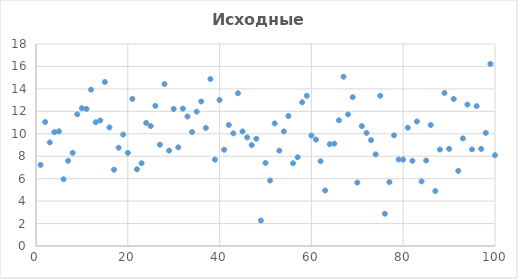
| Category | Series 0 |
|---|---|
| 0 | 7.227 |
| 1 | 11.049 |
| 2 | 9.231 |
| 3 | 10.143 |
| 4 | 10.217 |
| 5 | 5.946 |
| 6 | 7.589 |
| 7 | 8.308 |
| 8 | 11.736 |
| 9 | 12.28 |
| 10 | 12.221 |
| 11 | 13.93 |
| 12 | 11.027 |
| 13 | 11.186 |
| 14 | 14.617 |
| 15 | 10.566 |
| 16 | 6.797 |
| 17 | 8.76 |
| 18 | 9.929 |
| 19 | 8.302 |
| 20 | 13.111 |
| 21 | 6.838 |
| 22 | 7.375 |
| 23 | 10.964 |
| 24 | 10.684 |
| 25 | 12.489 |
| 26 | 9.027 |
| 27 | 14.429 |
| 28 | 8.499 |
| 29 | 12.217 |
| 30 | 8.795 |
| 31 | 12.24 |
| 32 | 11.539 |
| 33 | 10.156 |
| 34 | 11.974 |
| 35 | 12.879 |
| 36 | 10.52 |
| 37 | 14.877 |
| 38 | 7.695 |
| 39 | 13.009 |
| 40 | 8.579 |
| 41 | 10.788 |
| 42 | 10.04 |
| 43 | 13.611 |
| 44 | 10.205 |
| 45 | 9.678 |
| 46 | 8.993 |
| 47 | 9.558 |
| 48 | 2.269 |
| 49 | 7.402 |
| 50 | 5.835 |
| 51 | 10.924 |
| 52 | 8.496 |
| 53 | 10.206 |
| 54 | 11.582 |
| 55 | 7.371 |
| 56 | 7.908 |
| 57 | 12.808 |
| 58 | 13.386 |
| 59 | 9.837 |
| 60 | 9.481 |
| 61 | 7.552 |
| 62 | 4.945 |
| 63 | 9.073 |
| 64 | 9.121 |
| 65 | 11.201 |
| 66 | 15.086 |
| 67 | 11.724 |
| 68 | 13.264 |
| 69 | 5.65 |
| 70 | 10.683 |
| 71 | 10.072 |
| 72 | 9.431 |
| 73 | 8.166 |
| 74 | 13.388 |
| 75 | 2.87 |
| 76 | 5.69 |
| 77 | 9.862 |
| 78 | 7.708 |
| 79 | 7.696 |
| 80 | 10.542 |
| 81 | 7.59 |
| 82 | 11.098 |
| 83 | 5.754 |
| 84 | 7.614 |
| 85 | 10.782 |
| 86 | 4.9 |
| 87 | 8.596 |
| 88 | 13.637 |
| 89 | 8.655 |
| 90 | 13.106 |
| 91 | 6.697 |
| 92 | 9.583 |
| 93 | 12.602 |
| 94 | 8.609 |
| 95 | 12.464 |
| 96 | 8.65 |
| 97 | 10.078 |
| 98 | 16.222 |
| 99 | 8.086 |